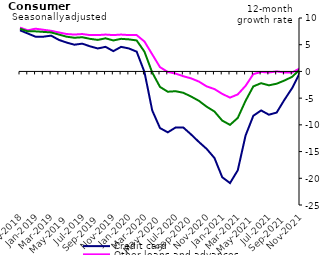
| Category | Credit card | Other loans and advances | Total |
|---|---|---|---|
| Nov-2018 | 7.7 | 8.2 | 8 |
| Dec-2018 | 7.1 | 7.7 | 7.5 |
| Jan-2019 | 6.5 | 8 | 7.5 |
| Feb-2019 | 6.5 | 7.8 | 7.4 |
| Mar-2019 | 6.7 | 7.6 | 7.3 |
| Apr-2019 | 5.9 | 7.3 | 6.9 |
| May-2019 | 5.4 | 7 | 6.5 |
| Jun-2019 | 5 | 6.9 | 6.3 |
| Jul-2019 | 5.2 | 7 | 6.4 |
| Aug-2019 | 4.7 | 6.8 | 6.1 |
| Sep-2019 | 4.3 | 6.8 | 5.9 |
| Oct-2019 | 4.6 | 6.9 | 6.2 |
| Nov-2019 | 3.8 | 6.8 | 5.8 |
| Dec-2019 | 4.6 | 6.9 | 6.1 |
| Jan-2020 | 4.3 | 6.8 | 6 |
| Feb-2020 | 3.7 | 6.8 | 5.8 |
| Mar-2020 | -0.1 | 5.6 | 3.7 |
| Apr-2020 | -7.3 | 3.2 | -0.2 |
| May-2020 | -10.6 | 0.8 | -2.9 |
| Jun-2020 | -11.4 | -0.1 | -3.8 |
| Jul-2020 | -10.5 | -0.4 | -3.7 |
| Aug-2020 | -10.5 | -0.9 | -4 |
| Sep-2020 | -11.8 | -1.3 | -4.7 |
| Oct-2020 | -13.2 | -1.9 | -5.5 |
| Nov-2020 | -14.5 | -2.8 | -6.6 |
| Dec-2020 | -16.2 | -3.3 | -7.5 |
| Jan-2021 | -19.8 | -4.2 | -9.2 |
| Feb-2021 | -20.9 | -4.9 | -10 |
| Mar-2021 | -18.5 | -4.3 | -8.7 |
| Apr-2021 | -12 | -2.7 | -5.5 |
| May-2021 | -8.3 | -0.5 | -2.8 |
| Jun-2021 | -7.3 | -0.1 | -2.2 |
| Jul-2021 | -8.1 | -0.2 | -2.6 |
| Aug-2021 | -7.7 | 0 | -2.3 |
| Sep-2021 | -5.3 | -0.2 | -1.7 |
| Oct-2021 | -3.1 | -0.2 | -1 |
| Nov-2021 | -0.2 | 0.6 | 0.4 |